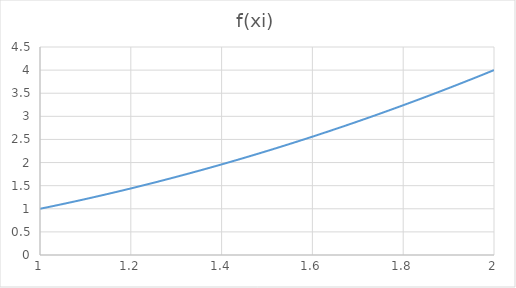
| Category | f(xi) |
|---|---|
| 1.0 | 1 |
| 1.005 | 1.01 |
| 1.01 | 1.02 |
| 1.015 | 1.03 |
| 1.02 | 1.04 |
| 1.025 | 1.051 |
| 1.03 | 1.061 |
| 1.035 | 1.071 |
| 1.04 | 1.082 |
| 1.045 | 1.092 |
| 1.05 | 1.102 |
| 1.055 | 1.113 |
| 1.06 | 1.124 |
| 1.065 | 1.134 |
| 1.07 | 1.145 |
| 1.075 | 1.156 |
| 1.08 | 1.166 |
| 1.085 | 1.177 |
| 1.09 | 1.188 |
| 1.095 | 1.199 |
| 1.1 | 1.21 |
| 1.105 | 1.221 |
| 1.11 | 1.232 |
| 1.115 | 1.243 |
| 1.12 | 1.254 |
| 1.125 | 1.266 |
| 1.13 | 1.277 |
| 1.135 | 1.288 |
| 1.14 | 1.3 |
| 1.145 | 1.311 |
| 1.15 | 1.322 |
| 1.155 | 1.334 |
| 1.16 | 1.346 |
| 1.165 | 1.357 |
| 1.17 | 1.369 |
| 1.175 | 1.381 |
| 1.18 | 1.392 |
| 1.185 | 1.404 |
| 1.19 | 1.416 |
| 1.195 | 1.428 |
| 1.2 | 1.44 |
| 1.205 | 1.452 |
| 1.21 | 1.464 |
| 1.21499999999999 | 1.476 |
| 1.22 | 1.488 |
| 1.22499999999999 | 1.501 |
| 1.23 | 1.513 |
| 1.23499999999999 | 1.525 |
| 1.23999999999999 | 1.538 |
| 1.24499999999999 | 1.55 |
| 1.25 | 1.562 |
| 1.255 | 1.575 |
| 1.25999999999999 | 1.588 |
| 1.26499999999999 | 1.6 |
| 1.26999999999999 | 1.613 |
| 1.27499999999999 | 1.626 |
| 1.27999999999999 | 1.638 |
| 1.28499999999999 | 1.651 |
| 1.28999999999999 | 1.664 |
| 1.29499999999999 | 1.677 |
| 1.29999999999999 | 1.69 |
| 1.30499999999999 | 1.703 |
| 1.30999999999999 | 1.716 |
| 1.31499999999999 | 1.729 |
| 1.31999999999999 | 1.742 |
| 1.32499999999999 | 1.756 |
| 1.32999999999999 | 1.769 |
| 1.33499999999999 | 1.782 |
| 1.33999999999999 | 1.796 |
| 1.34499999999999 | 1.809 |
| 1.34999999999999 | 1.822 |
| 1.35499999999999 | 1.836 |
| 1.35999999999999 | 1.85 |
| 1.36499999999999 | 1.863 |
| 1.36999999999999 | 1.877 |
| 1.37499999999999 | 1.891 |
| 1.37999999999999 | 1.904 |
| 1.38499999999999 | 1.918 |
| 1.38999999999999 | 1.932 |
| 1.39499999999999 | 1.946 |
| 1.39999999999999 | 1.96 |
| 1.40499999999999 | 1.974 |
| 1.40999999999999 | 1.988 |
| 1.41499999999999 | 2.002 |
| 1.41999999999999 | 2.016 |
| 1.42499999999999 | 2.031 |
| 1.42999999999999 | 2.045 |
| 1.43499999999999 | 2.059 |
| 1.43999999999999 | 2.074 |
| 1.44499999999999 | 2.088 |
| 1.44999999999999 | 2.102 |
| 1.45499999999999 | 2.117 |
| 1.45999999999999 | 2.132 |
| 1.46499999999999 | 2.146 |
| 1.46999999999999 | 2.161 |
| 1.47499999999999 | 2.176 |
| 1.47999999999999 | 2.19 |
| 1.48499999999999 | 2.205 |
| 1.48999999999999 | 2.22 |
| 1.49499999999999 | 2.235 |
| 1.49999999999999 | 2.25 |
| 1.50499999999999 | 2.265 |
| 1.50999999999999 | 2.28 |
| 1.51499999999999 | 2.295 |
| 1.51999999999999 | 2.31 |
| 1.52499999999999 | 2.326 |
| 1.52999999999999 | 2.341 |
| 1.53499999999999 | 2.356 |
| 1.53999999999999 | 2.372 |
| 1.54499999999999 | 2.387 |
| 1.54999999999999 | 2.402 |
| 1.55499999999999 | 2.418 |
| 1.55999999999999 | 2.434 |
| 1.56499999999999 | 2.449 |
| 1.56999999999999 | 2.465 |
| 1.57499999999999 | 2.481 |
| 1.57999999999999 | 2.496 |
| 1.58499999999999 | 2.512 |
| 1.58999999999999 | 2.528 |
| 1.59499999999999 | 2.544 |
| 1.59999999999999 | 2.56 |
| 1.60499999999999 | 2.576 |
| 1.60999999999999 | 2.592 |
| 1.61499999999999 | 2.608 |
| 1.61999999999999 | 2.624 |
| 1.62499999999999 | 2.641 |
| 1.62999999999999 | 2.657 |
| 1.63499999999999 | 2.673 |
| 1.63999999999999 | 2.69 |
| 1.64499999999999 | 2.706 |
| 1.64999999999999 | 2.722 |
| 1.65499999999999 | 2.739 |
| 1.65999999999999 | 2.756 |
| 1.66499999999999 | 2.772 |
| 1.66999999999999 | 2.789 |
| 1.67499999999999 | 2.806 |
| 1.67999999999999 | 2.822 |
| 1.68499999999998 | 2.839 |
| 1.68999999999998 | 2.856 |
| 1.69499999999998 | 2.873 |
| 1.69999999999999 | 2.89 |
| 1.70499999999998 | 2.907 |
| 1.70999999999998 | 2.924 |
| 1.71499999999998 | 2.941 |
| 1.71999999999999 | 2.958 |
| 1.72499999999998 | 2.976 |
| 1.72999999999998 | 2.993 |
| 1.73499999999998 | 3.01 |
| 1.73999999999998 | 3.028 |
| 1.74499999999998 | 3.045 |
| 1.74999999999998 | 3.062 |
| 1.75499999999998 | 3.08 |
| 1.75999999999998 | 3.098 |
| 1.76499999999998 | 3.115 |
| 1.76999999999998 | 3.133 |
| 1.77499999999998 | 3.151 |
| 1.77999999999998 | 3.168 |
| 1.78499999999998 | 3.186 |
| 1.78999999999998 | 3.204 |
| 1.79499999999998 | 3.222 |
| 1.79999999999998 | 3.24 |
| 1.80499999999998 | 3.258 |
| 1.80999999999998 | 3.276 |
| 1.81499999999998 | 3.294 |
| 1.81999999999998 | 3.312 |
| 1.82499999999998 | 3.331 |
| 1.82999999999998 | 3.349 |
| 1.83499999999998 | 3.367 |
| 1.83999999999998 | 3.386 |
| 1.84499999999998 | 3.404 |
| 1.84999999999998 | 3.422 |
| 1.85499999999998 | 3.441 |
| 1.85999999999998 | 3.46 |
| 1.86499999999998 | 3.478 |
| 1.86999999999998 | 3.497 |
| 1.87499999999998 | 3.516 |
| 1.87999999999998 | 3.534 |
| 1.88499999999998 | 3.553 |
| 1.88999999999998 | 3.572 |
| 1.89499999999998 | 3.591 |
| 1.89999999999998 | 3.61 |
| 1.90499999999998 | 3.629 |
| 1.90999999999998 | 3.648 |
| 1.91499999999998 | 3.667 |
| 1.91999999999998 | 3.686 |
| 1.92499999999998 | 3.706 |
| 1.92999999999998 | 3.725 |
| 1.93499999999998 | 3.744 |
| 1.93999999999998 | 3.764 |
| 1.94499999999998 | 3.783 |
| 1.94999999999998 | 3.802 |
| 1.95499999999998 | 3.822 |
| 1.95999999999998 | 3.842 |
| 1.96499999999998 | 3.861 |
| 1.96999999999998 | 3.881 |
| 1.97499999999998 | 3.901 |
| 1.97999999999998 | 3.92 |
| 1.98499999999998 | 3.94 |
| 1.98999999999998 | 3.96 |
| 1.99499999999998 | 3.98 |
| 1.99999999999998 | 4 |